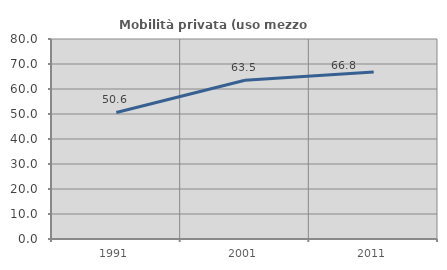
| Category | Mobilità privata (uso mezzo privato) |
|---|---|
| 1991.0 | 50.611 |
| 2001.0 | 63.519 |
| 2011.0 | 66.762 |